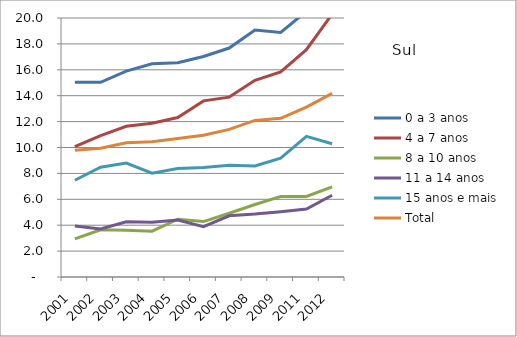
| Category | 0 a 3 anos | 4 a 7 anos | 8 a 10 anos | 11 a 14 anos | 15 anos e mais | Total |
|---|---|---|---|---|---|---|
| 2001.0 | 15.03 | 10.06 | 2.95 | 3.94 | 7.47 | 9.78 |
| 2002.0 | 15.03 | 10.92 | 3.65 | 3.71 | 8.48 | 9.95 |
| 2003.0 | 15.9 | 11.64 | 3.61 | 4.27 | 8.8 | 10.36 |
| 2004.0 | 16.46 | 11.87 | 3.54 | 4.23 | 8.02 | 10.44 |
| 2005.0 | 16.54 | 12.31 | 4.46 | 4.4 | 8.38 | 10.7 |
| 2006.0 | 17.03 | 13.6 | 4.28 | 3.89 | 8.45 | 10.94 |
| 2007.0 | 17.68 | 13.89 | 4.92 | 4.73 | 8.62 | 11.4 |
| 2008.0 | 19.07 | 15.19 | 5.6 | 4.86 | 8.57 | 12.09 |
| 2009.0 | 18.89 | 15.83 | 6.22 | 5.04 | 9.18 | 12.25 |
| 2011.0 | 20.51 | 17.55 | 6.22 | 5.25 | 10.86 | 13.12 |
| 2012.0 | 21.18 | 20.3 | 6.96 | 6.31 | 10.29 | 14.18 |